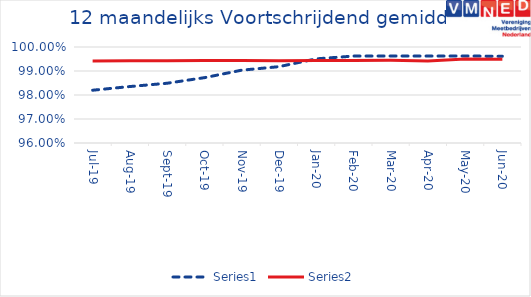
| Category | Series 0 | Series 1 |
|---|---|---|
| 2019-07-01 | 0.982 | 0.994 |
| 2019-08-01 | 0.984 | 0.994 |
| 2019-09-01 | 0.985 | 0.994 |
| 2019-10-01 | 0.987 | 0.994 |
| 2019-11-01 | 0.99 | 0.994 |
| 2019-12-01 | 0.992 | 0.994 |
| 2020-01-01 | 0.995 | 0.994 |
| 2020-02-01 | 0.996 | 0.994 |
| 2020-03-01 | 0.996 | 0.994 |
| 2020-04-01 | 0.996 | 0.994 |
| 2020-05-01 | 0.996 | 0.995 |
| 2020-06-01 | 0.996 | 0.995 |